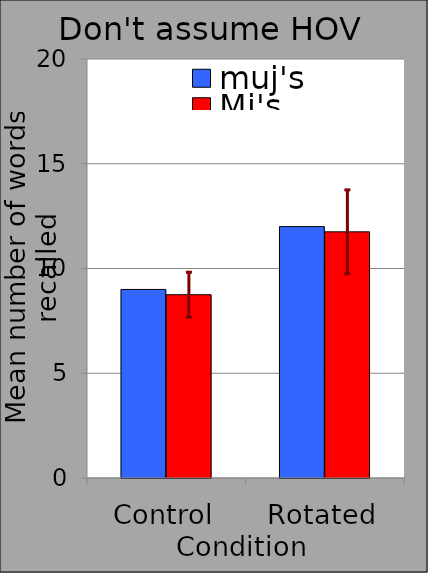
| Category | muj's | Mj's |
|---|---|---|
| Control | 9 | 8.75 |
| Rotated | 12 | 11.75 |